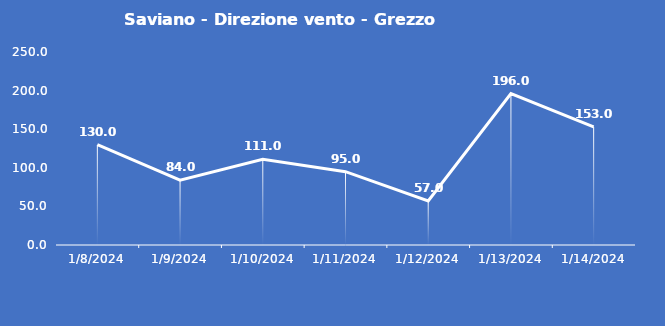
| Category | Saviano - Direzione vento - Grezzo (°N) |
|---|---|
| 1/8/24 | 130 |
| 1/9/24 | 84 |
| 1/10/24 | 111 |
| 1/11/24 | 95 |
| 1/12/24 | 57 |
| 1/13/24 | 196 |
| 1/14/24 | 153 |